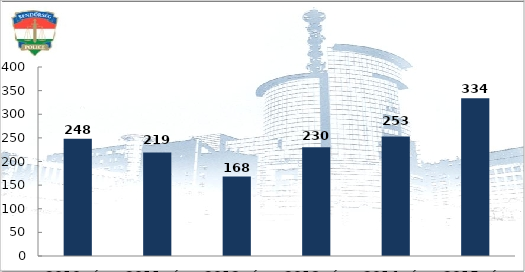
| Category | Bűncselekmény gyanúja miatti előállítások száma |
|---|---|
| 2010. év | 248 |
| 2011. év | 219 |
| 2012. év | 168 |
| 2013. év | 230 |
| 2014. év | 253 |
| 2015. év | 334 |